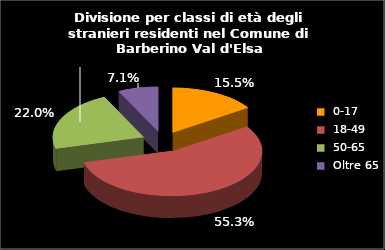
| Category | Series 0 |
|---|---|
| 0-17 | 50 |
| 18-49 | 178 |
| 50-65 | 71 |
| Oltre 65 | 23 |